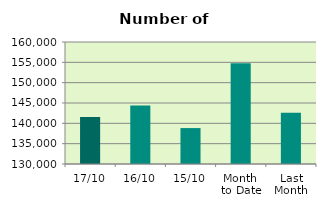
| Category | Series 0 |
|---|---|
| 17/10 | 141528 |
| 16/10 | 144378 |
| 15/10 | 138834 |
| Month 
to Date | 154797.077 |
| Last
Month | 142606.2 |